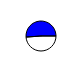
| Category | Series 0 |
|---|---|
| 0 | 5997266 |
| 1 | 6285730 |